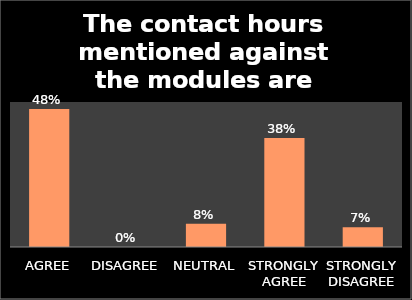
| Category | Series 0 |
|---|---|
| AGREE | 0.476 |
| DISAGREE | 0 |
| NEUTRAL | 0.08 |
| STRONGLY AGREE | 0.376 |
| STRONGLY DISAGREE | 0.068 |